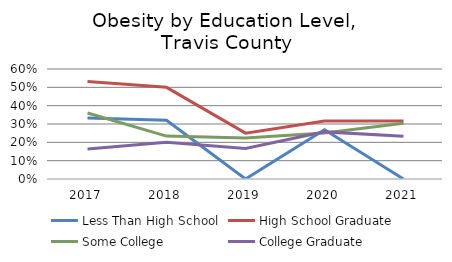
| Category | Less Than High School | High School Graduate | Some College | College Graduate |
|---|---|---|---|---|
| 2017.0 | 0.333 | 0.532 | 0.36 | 0.164 |
| 2018.0 | 0.32 | 0.5 | 0.234 | 0.201 |
| 2019.0 | 0 | 0.25 | 0.224 | 0.166 |
| 2020.0 | 0.269 | 0.316 | 0.251 | 0.257 |
| 2021.0 | 0 | 0.316 | 0.304 | 0.233 |